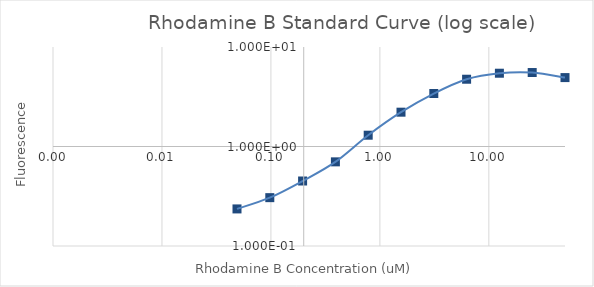
| Category | Series 1 |
|---|---|
| 50.0 | 4.927 |
| 25.0 | 5.539 |
| 12.5 | 5.451 |
| 6.25 | 4.744 |
| 3.125 | 3.408 |
| 1.5625 | 2.213 |
| 0.78125 | 1.299 |
| 0.390625 | 0.701 |
| 0.1953125 | 0.45 |
| 0.09765625 | 0.306 |
| 0.048828125 | 0.236 |